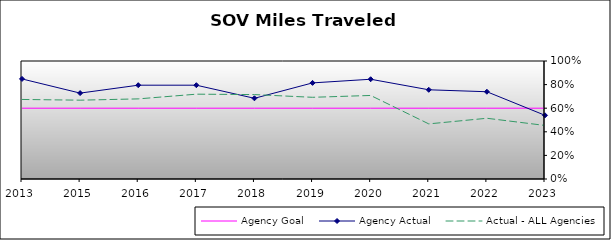
| Category | Agency Goal | Agency Actual | Actual - ALL Agencies |
|---|---|---|---|
| 2013.0 | 0.6 | 0.848 | 0.674 |
| 2015.0 | 0.6 | 0.728 | 0.668 |
| 2016.0 | 0.6 | 0.795 | 0.679 |
| 2017.0 | 0.6 | 0.795 | 0.719 |
| 2018.0 | 0.6 | 0.684 | 0.715 |
| 2019.0 | 0.6 | 0.814 | 0.692 |
| 2020.0 | 0.6 | 0.845 | 0.708 |
| 2021.0 | 0.6 | 0.756 | 0.467 |
| 2022.0 | 0.6 | 0.74 | 0.515 |
| 2023.0 | 0.6 | 0.54 | 0.454 |